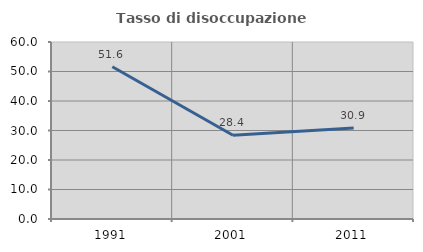
| Category | Tasso di disoccupazione giovanile  |
|---|---|
| 1991.0 | 51.592 |
| 2001.0 | 28.369 |
| 2011.0 | 30.882 |